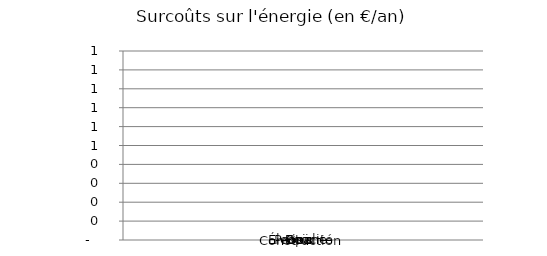
| Category | Construction | Électricité | Gaz  | Fioul | Propane | Bois  |
|---|---|---|---|---|---|---|
| surcoûts en € | 0 | 0 | 0 | 0 | 0 | 0 |